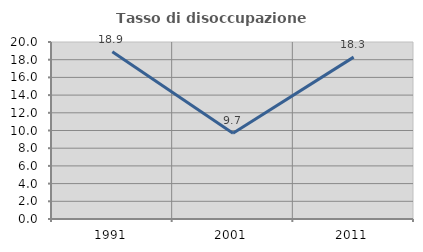
| Category | Tasso di disoccupazione giovanile  |
|---|---|
| 1991.0 | 18.898 |
| 2001.0 | 9.677 |
| 2011.0 | 18.293 |